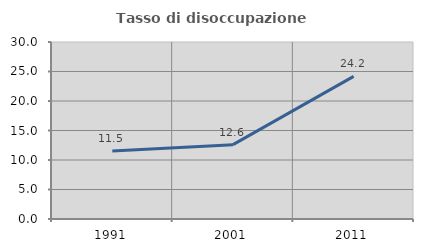
| Category | Tasso di disoccupazione giovanile  |
|---|---|
| 1991.0 | 11.518 |
| 2001.0 | 12.598 |
| 2011.0 | 24.176 |